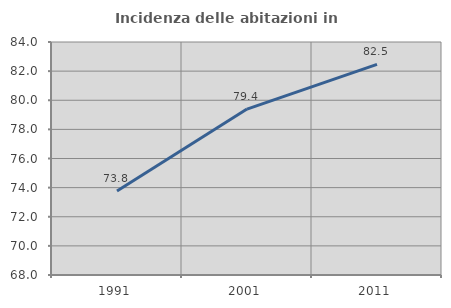
| Category | Incidenza delle abitazioni in proprietà  |
|---|---|
| 1991.0 | 73.763 |
| 2001.0 | 79.393 |
| 2011.0 | 82.461 |